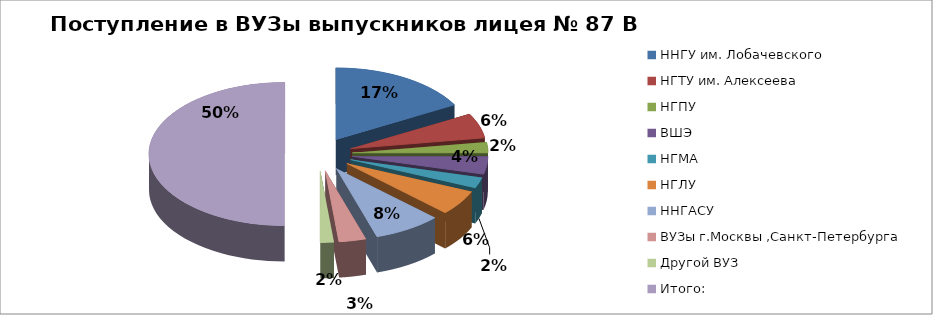
| Category | Кол. вып. |
|---|---|
| ННГУ им. Лобачевского | 21 |
| НГТУ им. Алексеева | 7 |
| НГПУ | 3 |
| ВШЭ | 5 |
| НГМА | 3 |
| НГЛУ | 7 |
| ННГАСУ | 10 |
| ВУЗы г.Москвы ,Санкт-Петербурга | 4 |
| Другой ВУЗ | 2 |
| Итого: | 62 |